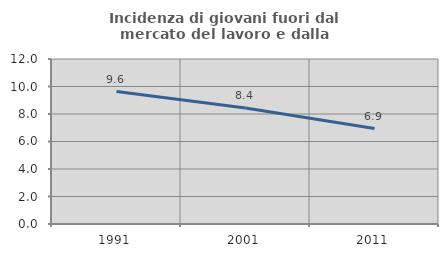
| Category | Incidenza di giovani fuori dal mercato del lavoro e dalla formazione  |
|---|---|
| 1991.0 | 9.629 |
| 2001.0 | 8.434 |
| 2011.0 | 6.939 |